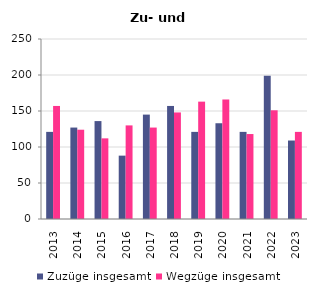
| Category | Zuzüge insgesamt | Wegzüge insgesamt |
|---|---|---|
| 2013.0 | 121 | 157 |
| 2014.0 | 127 | 124 |
| 2015.0 | 136 | 112 |
| 2016.0 | 88 | 130 |
| 2017.0 | 145 | 127 |
| 2018.0 | 157 | 148 |
| 2019.0 | 121 | 163 |
| 2020.0 | 133 | 166 |
| 2021.0 | 121 | 118 |
| 2022.0 | 199 | 151 |
| 2023.0 | 109 | 121 |